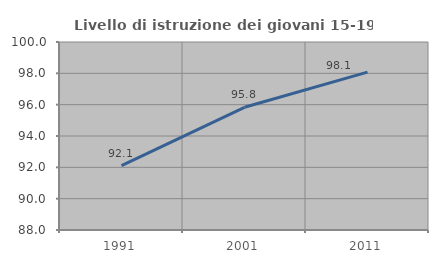
| Category | Livello di istruzione dei giovani 15-19 anni |
|---|---|
| 1991.0 | 92.105 |
| 2001.0 | 95.833 |
| 2011.0 | 98.077 |